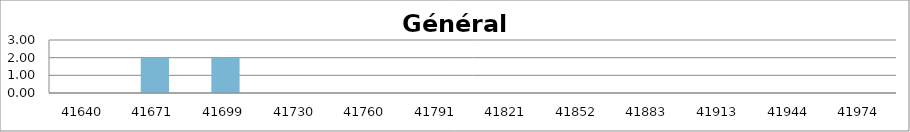
| Category | Générale |
|---|---|
| 2014-01-01 | 0 |
| 2014-02-01 | 2 |
| 2014-03-01 | 2 |
| 2014-04-01 | 0 |
| 2014-05-01 | 0 |
| 2014-06-01 | 0 |
| 2014-07-01 | 0 |
| 2014-08-01 | 0 |
| 2014-09-01 | 0 |
| 2014-10-01 | 0 |
| 2014-11-01 | 0 |
| 2014-12-01 | 0 |